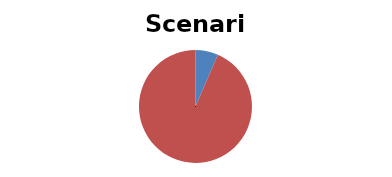
| Category | Series 0 |
|---|---|
| Short-Term | 0.065 |
| Long-Term | 0.935 |